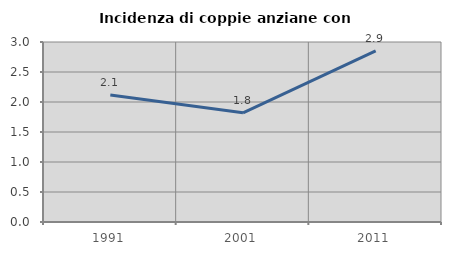
| Category | Incidenza di coppie anziane con figli |
|---|---|
| 1991.0 | 2.117 |
| 2001.0 | 1.821 |
| 2011.0 | 2.853 |